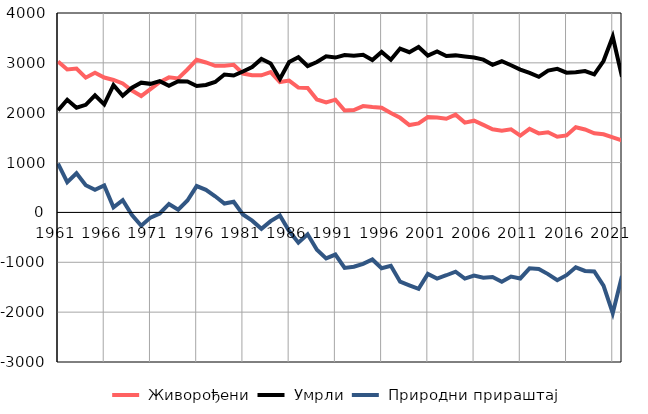
| Category |  Живорођени |  Умрли |  Природни прираштај |
|---|---|---|---|
| 1961.0 | 3026 | 2045 | 981 |
| 1962.0 | 2866 | 2260 | 606 |
| 1963.0 | 2885 | 2101 | 784 |
| 1964.0 | 2703 | 2158 | 545 |
| 1965.0 | 2803 | 2349 | 454 |
| 1966.0 | 2706 | 2166 | 540 |
| 1967.0 | 2657 | 2554 | 103 |
| 1968.0 | 2586 | 2341 | 245 |
| 1969.0 | 2446 | 2501 | -55 |
| 1970.0 | 2335 | 2603 | -268 |
| 1971.0 | 2475 | 2579 | -104 |
| 1972.0 | 2612 | 2633 | -21 |
| 1973.0 | 2709 | 2539 | 170 |
| 1974.0 | 2686 | 2631 | 55 |
| 1975.0 | 2867 | 2628 | 239 |
| 1976.0 | 3063 | 2535 | 528 |
| 1977.0 | 3008 | 2556 | 452 |
| 1978.0 | 2940 | 2616 | 324 |
| 1979.0 | 2944 | 2766 | 178 |
| 1980.0 | 2962 | 2747 | 215 |
| 1981.0 | 2786 | 2827 | -41 |
| 1982.0 | 2750 | 2916 | -166 |
| 1983.0 | 2749 | 3078 | -329 |
| 1984.0 | 2813 | 2988 | -175 |
| 1985.0 | 2615 | 2678 | -63 |
| 1986.0 | 2645 | 3018 | -373 |
| 1987.0 | 2505 | 3112 | -607 |
| 1988.0 | 2497 | 2936 | -439 |
| 1989.0 | 2267 | 3016 | -749 |
| 1990.0 | 2208 | 3130 | -922 |
| 1991.0 | 2261 | 3106 | -845 |
| 1992.0 | 2044 | 3157 | -1113 |
| 1993.0 | 2053 | 3143 | -1090 |
| 1994.0 | 2132 | 3163 | -1031 |
| 1995.0 | 2113 | 3056 | -943 |
| 1996.0 | 2100 | 3220 | -1120 |
| 1997.0 | 1993 | 3062 | -1069 |
| 1998.0 | 1898 | 3287 | -1389 |
| 1999.0 | 1753 | 3214 | -1461 |
| 2000.0 | 1786 | 3318 | -1532 |
| 2001.0 | 1913 | 3147 | -1234 |
| 2002.0 | 1904 | 3230 | -1326 |
| 2003.0 | 1879 | 3139 | -1260 |
| 2004.0 | 1961 | 3150 | -1189 |
| 2005.0 | 1801 | 3128 | -1327 |
| 2006.0 | 1840 | 3106 | -1266 |
| 2007.0 | 1756 | 3064 | -1308 |
| 2008.0 | 1668 | 2962 | -1294 |
| 2009.0 | 1641 | 3032 | -1391 |
| 2010.0 | 1666 | 2952 | -1286 |
| 2011.0 | 1542 | 2866 | -1324 |
| 2012.0 | 1676 | 2797 | -1121 |
| 2013.0 | 1585 | 2720 | -1135 |
| 2014.0 | 1609 | 2846 | -1237 |
| 2015.0 | 1519 | 2880 | -1361 |
| 2016.0 | 1544 | 2803 | -1259 |
| 2017.0 | 1709 | 2810 | -1101 |
| 2018.0 | 1663 | 2836 | -1173 |
| 2019.0 | 1586 | 2770 | -1184 |
| 2020.0 | 1567 | 3036 | -1469 |
| 2021.0 | 1505 | 3525 | -2020 |
| 2022.0 | 1445 | 2722 | -1277 |